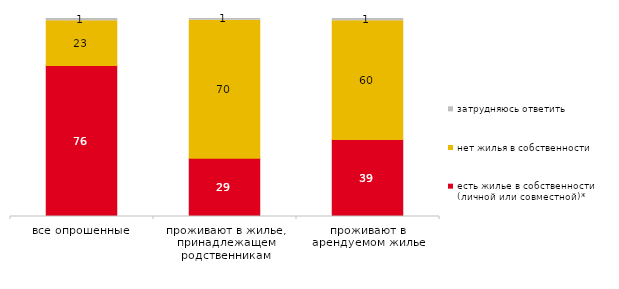
| Category | есть жилье в собственности (личной или совместной)* | нет жилья в собственности  | затрудняюсь ответить |
|---|---|---|---|
| все опрошенные | 76.207 | 22.598 | 1.195 |
| проживают в жилье, принадлежащем родственникам | 29.412 | 69.748 | 0.84 |
| проживают в арендуемом жилье | 38.889 | 60 | 1.111 |